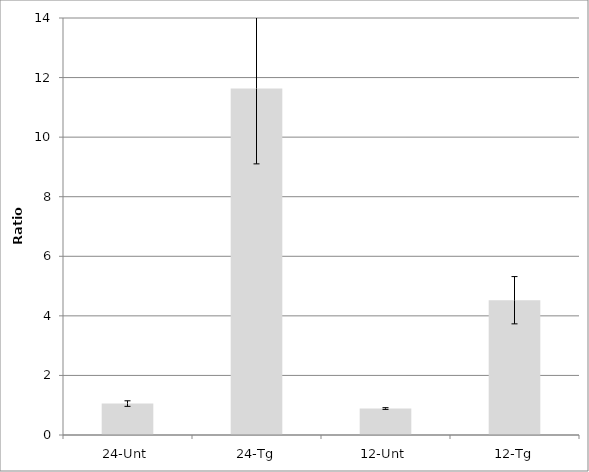
| Category | Ratio |
|---|---|
| 24-Unt | 1.055 |
| 24-Tg | 11.632 |
| 12-Unt | 0.889 |
| 12-Tg | 4.525 |